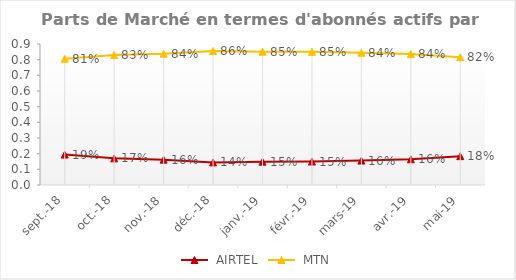
| Category | Series 13 | Series 14 |
|---|---|---|
| sept.-18 | 0.194 | 0.806 |
| oct.-18 | 0.17 | 0.83 |
| nov.-18 | 0.162 | 0.838 |
| déc.-18 | 0.144 | 0.856 |
| janv.-19 | 0.149 | 0.851 |
| févr.-19 | 0.15 | 0.85 |
| mars-19 | 0.156 | 0.844 |
| avr.-19 | 0.164 | 0.836 |
| mai-19 | 0.184 | 0.816 |